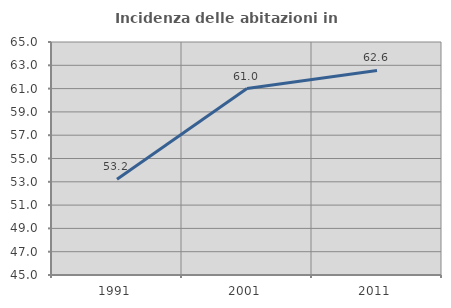
| Category | Incidenza delle abitazioni in proprietà  |
|---|---|
| 1991.0 | 53.211 |
| 2001.0 | 61 |
| 2011.0 | 62.557 |